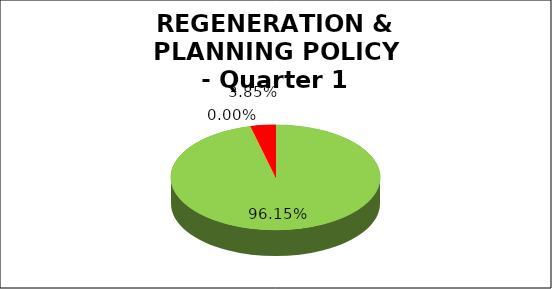
| Category | Q1 |
|---|---|
| Green | 0.962 |
| Amber | 0 |
| Red | 0.038 |